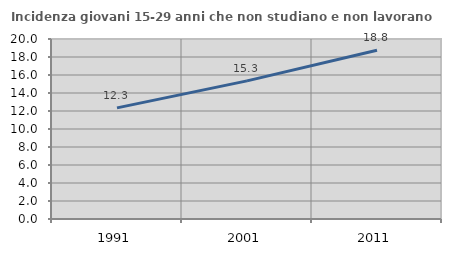
| Category | Incidenza giovani 15-29 anni che non studiano e non lavorano  |
|---|---|
| 1991.0 | 12.346 |
| 2001.0 | 15.344 |
| 2011.0 | 18.75 |